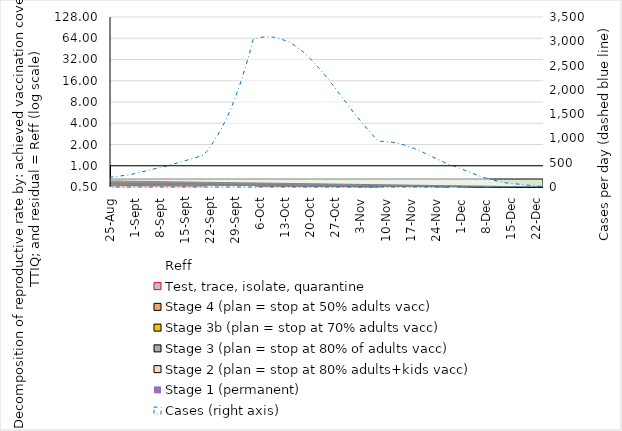
| Category | Reff | Test, trace, isolate, quarantine | Stage 4 (plan = stop at 50% adults vacc) | Stage 3b (plan = stop at 70% adults vacc) | Stage 3 (plan = stop at 80% of adults vacc) | Stage 2 (plan = stop at 80% adults+kids vacc) | Stage 1 (permanent) | Due to vaccination |
|---|---|---|---|---|---|---|---|---|
| 2021-08-25 | 1.254 | 0.456 | 0.92 | 0.464 | 0.589 | 0.65 | 0.705 | 1.461 |
| 2021-08-26 | 1.245 | 0.452 | 0.914 | 0.461 | 0.585 | 0.645 | 0.7 | 1.499 |
| 2021-08-27 | 1.246 | 0.438 | 0.907 | 0.457 | 0.581 | 0.64 | 0.695 | 1.536 |
| 2021-08-28 | 1.247 | 0.424 | 0.9 | 0.454 | 0.576 | 0.636 | 0.69 | 1.574 |
| 2021-08-29 | 1.248 | 0.41 | 0.893 | 0.45 | 0.572 | 0.631 | 0.684 | 1.611 |
| 2021-08-30 | 1.249 | 0.397 | 0.886 | 0.447 | 0.567 | 0.626 | 0.679 | 1.649 |
| 2021-08-31 | 1.25 | 0.384 | 0.879 | 0.443 | 0.563 | 0.621 | 0.674 | 1.686 |
| 2021-09-01 | 1.25 | 0.37 | 0.873 | 0.44 | 0.559 | 0.616 | 0.669 | 1.723 |
| 2021-09-02 | 1.254 | 0.354 | 0.866 | 0.436 | 0.554 | 0.611 | 0.663 | 1.761 |
| 2021-09-03 | 1.257 | 0.338 | 0.859 | 0.433 | 0.55 | 0.607 | 0.658 | 1.798 |
| 2021-09-04 | 1.259 | 0.323 | 0.852 | 0.43 | 0.546 | 0.602 | 0.653 | 1.836 |
| 2021-09-05 | 1.26 | 0.31 | 0.845 | 0.426 | 0.541 | 0.597 | 0.648 | 1.873 |
| 2021-09-06 | 1.26 | 0.297 | 0.838 | 0.423 | 0.537 | 0.592 | 0.642 | 1.911 |
| 2021-09-07 | 1.258 | 0.286 | 0.831 | 0.419 | 0.532 | 0.587 | 0.637 | 1.948 |
| 2021-09-08 | 1.256 | 0.276 | 0.825 | 0.416 | 0.528 | 0.582 | 0.632 | 1.986 |
| 2021-09-09 | 1.252 | 0.266 | 0.818 | 0.412 | 0.524 | 0.578 | 0.627 | 2.023 |
| 2021-09-10 | 1.249 | 0.257 | 0.811 | 0.409 | 0.519 | 0.573 | 0.622 | 2.061 |
| 2021-09-11 | 1.245 | 0.249 | 0.804 | 0.405 | 0.515 | 0.568 | 0.616 | 2.098 |
| 2021-09-12 | 1.24 | 0.241 | 0.797 | 0.402 | 0.51 | 0.563 | 0.611 | 2.136 |
| 2021-09-13 | 1.235 | 0.233 | 0.79 | 0.399 | 0.506 | 0.558 | 0.606 | 2.173 |
| 2021-09-14 | 1.229 | 0.226 | 0.784 | 0.395 | 0.502 | 0.553 | 0.601 | 2.211 |
| 2021-09-15 | 1.223 | 0.22 | 0.777 | 0.392 | 0.497 | 0.549 | 0.595 | 2.248 |
| 2021-09-16 | 1.216 | 0.214 | 0.77 | 0.388 | 0.493 | 0.544 | 0.59 | 2.286 |
| 2021-09-17 | 1.209 | 0.208 | 0.763 | 0.385 | 0.489 | 0.539 | 0.585 | 2.323 |
| 2021-09-18 | 1.201 | 0.203 | 0.756 | 0.381 | 0.484 | 0.534 | 0.58 | 2.36 |
| 2021-09-19 | 1.193 | 0.198 | 0.749 | 0.378 | 0.48 | 0.529 | 0.574 | 2.398 |
| 2021-09-20 | 1.185 | 0.194 | 0.743 | 0.374 | 0.475 | 0.524 | 0.569 | 2.435 |
| 2021-09-21 | 1.81 | 0.292 | 0 | 0.371 | 0.471 | 0.52 | 0.564 | 2.473 |
| 2021-09-22 | 1.803 | 0.279 | 0 | 0.367 | 0.467 | 0.515 | 0.559 | 2.51 |
| 2021-09-23 | 1.793 | 0.269 | 0 | 0.364 | 0.462 | 0.51 | 0.553 | 2.548 |
| 2021-09-24 | 1.781 | 0.262 | 0 | 0.361 | 0.458 | 0.505 | 0.548 | 2.585 |
| 2021-09-25 | 1.767 | 0.257 | 0 | 0.357 | 0.453 | 0.5 | 0.543 | 2.623 |
| 2021-09-26 | 1.752 | 0.252 | 0 | 0.354 | 0.449 | 0.495 | 0.538 | 2.66 |
| 2021-09-27 | 1.736 | 0.249 | 0 | 0.35 | 0.445 | 0.491 | 0.532 | 2.698 |
| 2021-09-28 | 1.719 | 0.246 | 0 | 0.347 | 0.44 | 0.486 | 0.527 | 2.735 |
| 2021-09-29 | 1.702 | 0.243 | 0 | 0.343 | 0.436 | 0.481 | 0.522 | 2.773 |
| 2021-09-30 | 1.685 | 0.241 | 0 | 0.34 | 0.432 | 0.476 | 0.517 | 2.81 |
| 2021-10-01 | 1.668 | 0.238 | 0 | 0.336 | 0.427 | 0.471 | 0.511 | 2.848 |
| 2021-10-02 | 1.651 | 0.236 | 0 | 0.333 | 0.423 | 0.466 | 0.506 | 2.885 |
| 2021-10-03 | 1.634 | 0.233 | 0 | 0.33 | 0.418 | 0.462 | 0.501 | 2.922 |
| 2021-10-04 | 1.617 | 0.231 | 0 | 0.326 | 0.414 | 0.457 | 0.496 | 2.96 |
| 2021-10-05 | 1.04 | 0.149 | 0.64 | 0.323 | 0.41 | 0.452 | 0.49 | 2.997 |
| 2021-10-06 | 1.029 | 0.147 | 0.633 | 0.319 | 0.405 | 0.447 | 0.485 | 3.035 |
| 2021-10-07 | 1.018 | 0.145 | 0.626 | 0.316 | 0.401 | 0.442 | 0.48 | 3.072 |
| 2021-10-08 | 1.006 | 0.144 | 0.619 | 0.312 | 0.397 | 0.437 | 0.475 | 3.11 |
| 2021-10-09 | 0.995 | 0.142 | 0.612 | 0.309 | 0.392 | 0.433 | 0.469 | 3.147 |
| 2021-10-10 | 0.984 | 0.141 | 0.606 | 0.305 | 0.388 | 0.428 | 0.464 | 3.185 |
| 2021-10-11 | 0.973 | 0.139 | 0.599 | 0.302 | 0.383 | 0.423 | 0.459 | 3.222 |
| 2021-10-12 | 0.962 | 0.137 | 0.592 | 0.298 | 0.379 | 0.418 | 0.454 | 3.26 |
| 2021-10-13 | 0.951 | 0.136 | 0.585 | 0.295 | 0.375 | 0.413 | 0.448 | 3.297 |
| 2021-10-14 | 0.94 | 0.134 | 0.578 | 0.292 | 0.37 | 0.408 | 0.443 | 3.335 |
| 2021-10-15 | 0.929 | 0.133 | 0.571 | 0.288 | 0.366 | 0.404 | 0.438 | 3.372 |
| 2021-10-16 | 0.917 | 0.131 | 0.565 | 0.285 | 0.361 | 0.399 | 0.433 | 3.41 |
| 2021-10-17 | 0.906 | 0.129 | 0.558 | 0.281 | 0.357 | 0.394 | 0.427 | 3.447 |
| 2021-10-18 | 0.895 | 0.128 | 0.551 | 0.278 | 0.353 | 0.389 | 0.422 | 3.484 |
| 2021-10-19 | 0.884 | 0.126 | 0.544 | 0.274 | 0.348 | 0.384 | 0.417 | 3.522 |
| 2021-10-20 | 0.873 | 0.125 | 0.537 | 0.271 | 0.344 | 0.379 | 0.412 | 3.559 |
| 2021-10-21 | 0.862 | 0.123 | 0.53 | 0.267 | 0.34 | 0.375 | 0.406 | 3.597 |
| 2021-10-22 | 0.851 | 0.122 | 0.523 | 0.264 | 0.335 | 0.37 | 0.401 | 3.634 |
| 2021-10-23 | 0.84 | 0.12 | 0.517 | 0.26 | 0.331 | 0.365 | 0.396 | 3.672 |
| 2021-10-24 | 0.828 | 0.118 | 0.51 | 0.257 | 0.326 | 0.36 | 0.391 | 3.709 |
| 2021-10-25 | 0.817 | 0.117 | 0.503 | 0.254 | 0.322 | 0.355 | 0.385 | 3.747 |
| 2021-10-26 | 0.806 | 0.115 | 0.496 | 0.25 | 0.318 | 0.35 | 0.38 | 3.784 |
| 2021-10-27 | 0.795 | 0.114 | 0.489 | 0.247 | 0.313 | 0.346 | 0.375 | 3.822 |
| 2021-10-28 | 0.784 | 0.112 | 0.482 | 0.243 | 0.309 | 0.341 | 0.37 | 3.859 |
| 2021-10-29 | 0.773 | 0.11 | 0.476 | 0.24 | 0.304 | 0.336 | 0.364 | 3.897 |
| 2021-10-30 | 0.762 | 0.109 | 0.469 | 0.236 | 0.3 | 0.331 | 0.359 | 3.934 |
| 2021-10-31 | 0.751 | 0.107 | 0.462 | 0.233 | 0.296 | 0.326 | 0.354 | 3.972 |
| 2021-11-01 | 0.739 | 0.106 | 0.455 | 0.229 | 0.291 | 0.321 | 0.349 | 4.009 |
| 2021-11-02 | 0.728 | 0.104 | 0.448 | 0.226 | 0.287 | 0.317 | 0.343 | 4.046 |
| 2021-11-03 | 0.717 | 0.103 | 0.441 | 0.223 | 0.283 | 0.312 | 0.338 | 4.084 |
| 2021-11-04 | 0.706 | 0.101 | 0.435 | 0.219 | 0.278 | 0.307 | 0.333 | 4.121 |
| 2021-11-05 | 0.695 | 0.1 | 0.428 | 0.216 | 0.274 | 0.302 | 0.328 | 4.159 |
| 2021-11-06 | 0.683 | 0.098 | 0.421 | 0.212 | 0.269 | 0.297 | 0.323 | 4.196 |
| 2021-11-07 | 0.672 | 0.097 | 0.414 | 0.209 | 0.265 | 0.292 | 0.317 | 4.234 |
| 2021-11-08 | 0.66 | 0.096 | 0.407 | 0.205 | 0.261 | 0.288 | 0.312 | 4.271 |
| 2021-11-09 | 0.997 | 0.147 | 0 | 0.202 | 0.256 | 0.283 | 0.307 | 4.309 |
| 2021-11-10 | 0.98 | 0.144 | 0 | 0.198 | 0.252 | 0.278 | 0.302 | 4.346 |
| 2021-11-11 | 0.963 | 0.142 | 0 | 0.195 | 0.248 | 0.273 | 0.296 | 4.384 |
| 2021-11-12 | 0.946 | 0.139 | 0 | 0.191 | 0.243 | 0.268 | 0.291 | 4.421 |
| 2021-11-13 | 0.929 | 0.137 | 0 | 0.188 | 0.239 | 0.263 | 0.286 | 4.459 |
| 2021-11-14 | 0.911 | 0.135 | 0 | 0.185 | 0.234 | 0.259 | 0.281 | 4.496 |
| 2021-11-15 | 0.894 | 0.133 | 0 | 0.181 | 0.23 | 0.254 | 0.275 | 4.534 |
| 2021-11-16 | 0.876 | 0.13 | 0 | 0.178 | 0.226 | 0.249 | 0.27 | 4.571 |
| 2021-11-17 | 0.859 | 0.128 | 0 | 0.174 | 0.221 | 0.244 | 0.265 | 4.608 |
| 2021-11-18 | 0.841 | 0.127 | 0 | 0.171 | 0.217 | 0.239 | 0.26 | 4.646 |
| 2021-11-19 | 0.823 | 0.125 | 0 | 0.167 | 0.212 | 0.234 | 0.254 | 4.683 |
| 2021-11-20 | 0.805 | 0.123 | 0 | 0.164 | 0.208 | 0.23 | 0.249 | 4.721 |
| 2021-11-21 | 0.787 | 0.122 | 0 | 0.16 | 0.204 | 0.225 | 0.244 | 4.758 |
| 2021-11-22 | 0.768 | 0.121 | 0 | 0.157 | 0.199 | 0.22 | 0.239 | 4.796 |
| 2021-11-23 | 0.75 | 0.12 | 0 | 0.154 | 0.195 | 0.215 | 0.233 | 4.833 |
| 2021-11-24 | 0.73 | 0.12 | 0 | 0.15 | 0.191 | 0.21 | 0.228 | 4.871 |
| 2021-11-25 | 0.711 | 0.12 | 0 | 0.147 | 0.186 | 0.205 | 0.223 | 4.908 |
| 2021-11-26 | 0.691 | 0.12 | 0 | 0.143 | 0.182 | 0.201 | 0.218 | 4.946 |
| 2021-11-27 | 0.671 | 0.121 | 0 | 0.14 | 0.177 | 0.196 | 0.212 | 4.983 |
| 2021-11-28 | 0.765 | 0.143 | 0 | 0 | 0.173 | 0.191 | 0.207 | 5.021 |
| 2021-11-29 | 0.742 | 0.144 | 0 | 0 | 0.169 | 0.186 | 0.202 | 5.058 |
| 2021-11-30 | 0.718 | 0.144 | 0 | 0 | 0.164 | 0.181 | 0.197 | 5.096 |
| 2021-12-01 | 0.693 | 0.146 | 0 | 0 | 0.16 | 0.176 | 0.191 | 5.133 |
| 2021-12-02 | 0.668 | 0.148 | 0 | 0 | 0.156 | 0.172 | 0.186 | 5.17 |
| 2021-12-03 | 0.642 | 0.151 | 0 | 0 | 0.151 | 0.167 | 0.181 | 5.208 |
| 2021-12-04 | 0.615 | 0.155 | 0 | 0 | 0.147 | 0.162 | 0.176 | 5.245 |
| 2021-12-05 | 0.587 | 0.16 | 0 | 0 | 0.142 | 0.157 | 0.17 | 5.283 |
| 2021-12-06 | 0.559 | 0.166 | 0 | 0 | 0.138 | 0.152 | 0.165 | 5.32 |
| 2021-12-07 | 0.529 | 0.172 | 0 | 0 | 0.134 | 0.147 | 0.16 | 5.358 |
| 2021-12-08 | 0.595 | 0.213 | 0 | 0 | 0 | 0.143 | 0.155 | 5.395 |
| 2021-12-09 | 0.563 | 0.217 | 0 | 0 | 0 | 0.138 | 0.149 | 5.433 |
| 2021-12-10 | 0.531 | 0.222 | 0 | 0 | 0 | 0.133 | 0.144 | 5.47 |
| 2021-12-11 | 0.498 | 0.227 | 0 | 0 | 0 | 0.128 | 0.139 | 5.508 |
| 2021-12-12 | 0.466 | 0.232 | 0 | 0 | 0 | 0.123 | 0.134 | 5.545 |
| 2021-12-13 | 0.511 | 0.278 | 0 | 0 | 0 | 0 | 0.128 | 5.583 |
| 2021-12-14 | 0.478 | 0.279 | 0 | 0 | 0 | 0 | 0.123 | 5.62 |
| 2021-12-15 | 0.446 | 0.279 | 0 | 0 | 0 | 0 | 0.118 | 5.658 |
| 2021-12-16 | 0.419 | 0.273 | 0 | 0 | 0 | 0 | 0.113 | 5.695 |
| 2021-12-17 | 0.393 | 0.267 | 0 | 0 | 0 | 0 | 0.107 | 5.732 |
| 2021-12-18 | 0.367 | 0.261 | 0 | 0 | 0 | 0 | 0.102 | 5.77 |
| 2021-12-19 | 0.341 | 0.254 | 0 | 0 | 0 | 0 | 0.097 | 5.807 |
| 2021-12-20 | 0.316 | 0.248 | 0 | 0 | 0 | 0 | 0.092 | 5.845 |
| 2021-12-21 | 0.29 | 0.241 | 0 | 0 | 0 | 0 | 0.086 | 5.882 |
| 2021-12-22 | 0.266 | 0.233 | 0 | 0 | 0 | 0 | 0.081 | 5.92 |
| 2021-12-23 | 0.243 | 0.223 | 0 | 0 | 0 | 0 | 0.076 | 5.957 |
| 2021-12-24 | 0.222 | 0.212 | 0 | 0 | 0 | 0 | 0.071 | 5.995 |